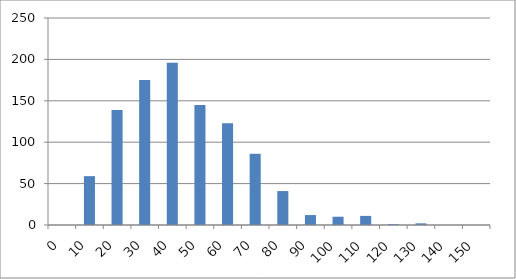
| Category | Series 0 |
|---|---|
| 0.0 | 0 |
| 10.0 | 59 |
| 20.0 | 139 |
| 30.0 | 175 |
| 40.0 | 196 |
| 50.0 | 145 |
| 60.0 | 123 |
| 70.0 | 86 |
| 80.0 | 41 |
| 90.0 | 12 |
| 100.0 | 10 |
| 110.0 | 11 |
| 120.0 | 1 |
| 130.0 | 2 |
| 140.0 | 0 |
| 150.0 | 0 |